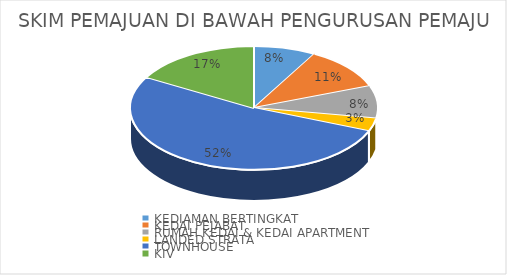
| Category | Series 0 |
|---|---|
| KEDIAMAN BERTINGKAT  | 86 |
| KEDAI PEJABAT | 118 |
| RUMAH KEDAI & KEDAI APARTMENT | 90 |
| LANDED STRATA | 36 |
| TOWNHOUSE | 553 |
| KIV | 177 |